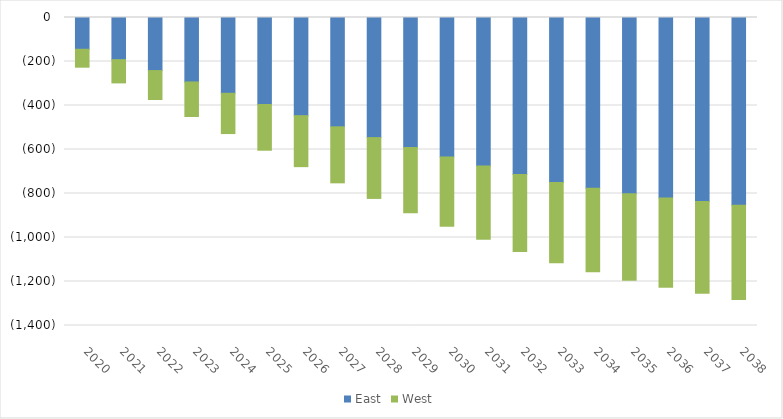
| Category | East | West |
|---|---|---|
| 2020.0 | -144.384 | -81.479 |
| 2021.0 | -191.702 | -105.523 |
| 2022.0 | -241.278 | -131.479 |
| 2023.0 | -292.952 | -157.042 |
| 2024.0 | -344.513 | -183.028 |
| 2025.0 | -395.579 | -207.716 |
| 2026.0 | -446.308 | -231.6 |
| 2027.0 | -496.952 | -254.539 |
| 2028.0 | -545.899 | -276.49 |
| 2029.0 | -590.906 | -296.284 |
| 2030.0 | -634.256 | -315.015 |
| 2031.0 | -674.441 | -332.955 |
| 2032.0 | -713.476 | -349.968 |
| 2033.0 | -749.659 | -365.245 |
| 2034.0 | -776.701 | -379.304 |
| 2035.0 | -801.248 | -392.902 |
| 2036.0 | -820.426 | -405.811 |
| 2037.0 | -836.488 | -417.402 |
| 2038.0 | -853.583 | -428.446 |